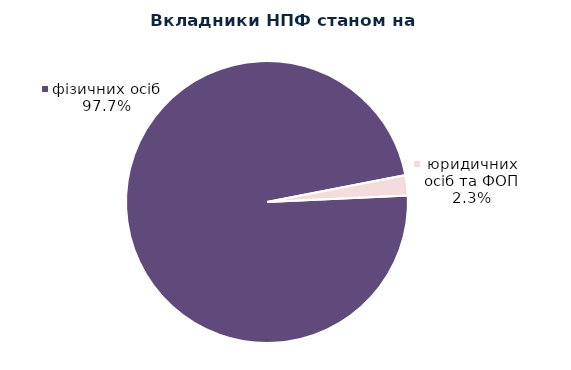
| Category | Series 0 |
|---|---|
| юридичних осіб та ФОП | 1999 |
| фізичних осіб | 84198 |